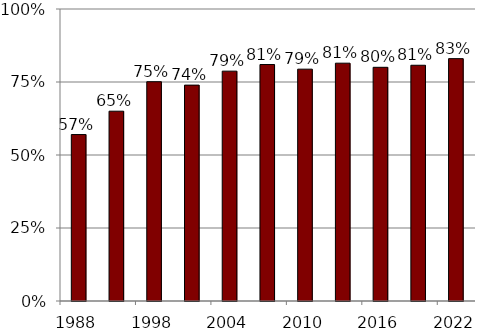
| Category | Series 0 |
|---|---|
| 1988.0 | 0.57 |
| 1993.0 | 0.65 |
| 1998.0 | 0.751 |
| 2001.0 | 0.739 |
| 2004.0 | 0.787 |
| 2007.0 | 0.81 |
| 2010.0 | 0.794 |
| 2013.0 | 0.814 |
| 2016.0 | 0.8 |
| 2019.0 | 0.807 |
| 2022.0 | 0.83 |